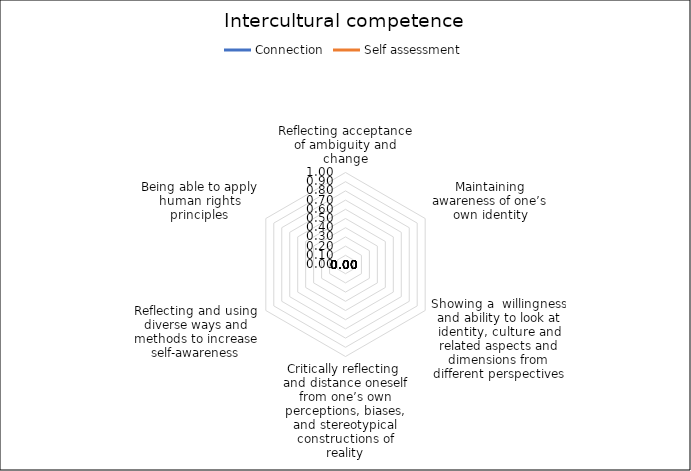
| Category | Connection | Self assessment |
|---|---|---|
| Reflecting acceptance of ambiguity and change | 0 | 0 |
| Maintaining awareness of one’s own identity | 0 | 0 |
| Showing a  willingness and ability to look at identity, culture and related aspects and dimensions from different perspectives | 0 | 0 |
| Critically reflecting  and distance oneself from one’s own perceptions, biases, and stereotypical constructions of reality | 0 | 0 |
| Reflecting and using diverse ways and methods to increase self-awareness | 0 | 0 |
| Being able to apply human rights principles | 0 | 0 |